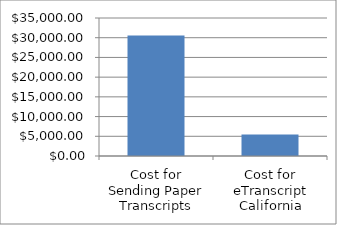
| Category | Series 0 |
|---|---|
| 0 | 30559.5 |
| 1 | 5460 |